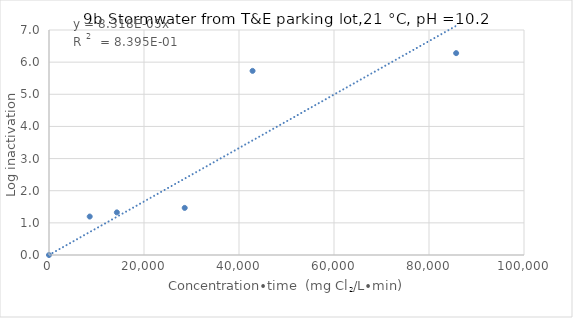
| Category | Series 0 |
|---|---|
| 0.0 | 0 |
| 8571.428571428572 | 1.196 |
| 14285.714285714286 | 1.326 |
| 28571.428571428572 | 1.465 |
| 42857.14285714286 | 5.728 |
| 85714.28571428572 | 6.28 |